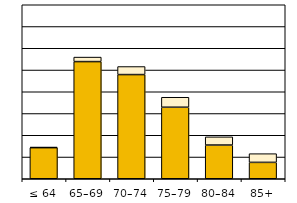
| Category | sólo  Single pension | v souběhu  Combined pension |
|---|---|---|
| ≤ 64 | 71513 | 1222 |
| 65–69 | 269343 | 10329 |
| 70–74 | 239495 | 18494 |
| 75–79 | 164412 | 22965 |
| 80–84 | 77481 | 18847 |
| 85+ | 37665 | 19995 |